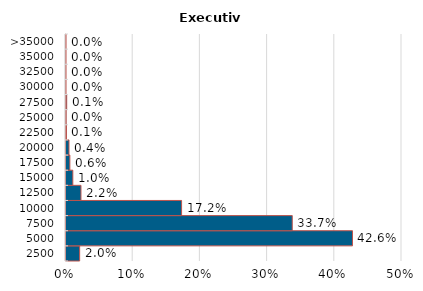
| Category | Executivo |
|---|---|
| 2500 | 0.02 |
| 5000 | 0.426 |
| 7500 | 0.337 |
| 10000 | 0.172 |
| 12500 | 0.022 |
| 15000 | 0.01 |
| 17500 | 0.006 |
| 20000 | 0.004 |
| 22500 | 0.001 |
| 25000 | 0 |
| 27500 | 0.001 |
| 30000 | 0 |
| 32500 | 0 |
| 35000 | 0 |
| >35000 | 0 |